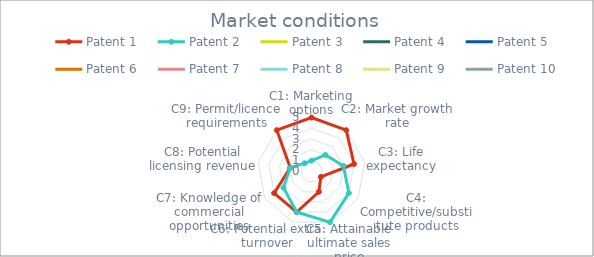
| Category | Patent 1 | Patent 2 | Patent 3 | Patent 4 | Patent 5 | Patent 6 | Patent 7 | Patent 8 | Patent 9 | Patent 10 |
|---|---|---|---|---|---|---|---|---|---|---|
| C1: Marketing options | 5 | 1 | 0 | 0 | 0 | 0 | 0 | 0 | 0 | 0 |
| C2: Market growth rate | 5 | 2 | 0 | 0 | 0 | 0 | 0 | 0 | 0 | 0 |
| C3: Life expectancy | 4 | 3 | 0 | 0 | 0 | 0 | 0 | 0 | 0 | 0 |
| C4: Competitive/substitute products | 1 | 4 | 0 | 0 | 0 | 0 | 0 | 0 | 0 | 0 |
| C5: Attainable ultimate sales price | 2 | 5 | 0 | 0 | 0 | 0 | 0 | 0 | 0 | 0 |
| C6: Potential extra turnover | 4 | 4 | 0 | 0 | 0 | 0 | 0 | 0 | 0 | 0 |
| C7: Knowledge of commercial opportunities | 4 | 3 | 0 | 0 | 0 | 0 | 0 | 0 | 0 | 0 |
| C8: Potential licensing revenue | 2 | 2 | 0 | 0 | 0 | 0 | 0 | 0 | 0 | 0 |
| C9: Permit/licence requirements | 5 | 1 | 0 | 0 | 0 | 0 | 0 | 0 | 0 | 0 |